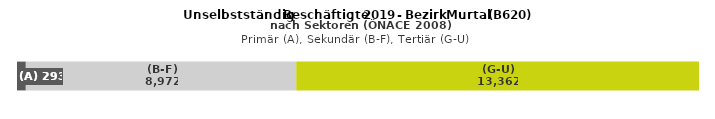
| Category | (A) | (B-F) | (G-U) |
|---|---|---|---|
| 0 | 293 | 8972 | 13362 |